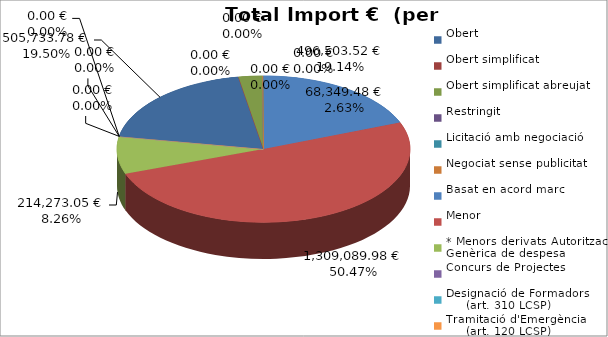
| Category | Total preu
(amb IVA) |
|---|---|
| Obert | 505733.78 |
| Obert simplificat | 0 |
| Obert simplificat abreujat | 68349.48 |
| Restringit | 0 |
| Licitació amb negociació | 0 |
| Negociat sense publicitat | 0 |
| Basat en acord marc | 496503.52 |
| Menor | 1309089.98 |
| * Menors derivats Autorització Genèrica de despesa | 214273.05 |
| Concurs de Projectes | 0 |
| Designació de Formadors
     (art. 310 LCSP) | 0 |
| Tramitació d'Emergència
     (art. 120 LCSP) | 0 |